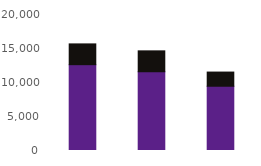
| Category | Online | Telephony |
|---|---|---|
| Oct23 | 12621 | 3057 |
| Nov23 | 11581 | 3073 |
| Dec23 | 9449 | 2086 |